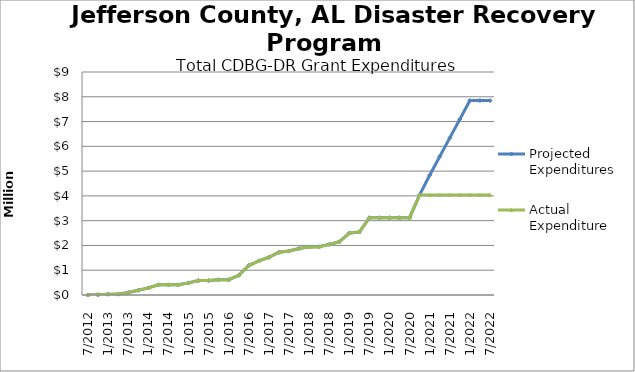
| Category | Projected Expenditures | Actual Expenditure |
|---|---|---|
| 7/2012 | 0 | 0 |
| 10/2012 | 14612 | 14612.19 |
| 1/2013 | 35137 | 35137.15 |
| 4/2013 | 35137 | 35137.15 |
| 7/2013 | 99693 | 99693.07 |
| 10/2013 | 190645 | 190645.12 |
| 1/2014 | 288122 | 288121.83 |
| 4/2014 | 410721 | 410720.72 |
| 7/2014 | 410721 | 410720.72 |
| 10/2014 | 410721 | 410720.72 |
| 1/2015 | 489424 | 489424.59 |
| 4/2015 | 584140 | 584140.61 |
| 7/2015 | 584140 | 584140.61 |
| 10/2015 | 616385 | 616385.28 |
| 1/2016 | 616385 | 616385.28 |
| 4/2016 | 795673 | 795673.36 |
| 7/2016 | 1189983 | 1189983.1 |
| 10/2016 | 1377739 | 1377739.09 |
| 1/2017 | 1523119 | 1523119.53 |
| 4/2017 | 1724726 | 1724725.79 |
| 7/2017 | 1773324 | 1773324.65 |
| 10/2017 | 1878724 | 1878724.29 |
| 1/2018 | 1941962 | 1941962.48 |
| 4/2018 | 1947910 | 1947910.72 |
| 7/2018 | 2042194 | 2042194.45 |
| 10/2018 | 2148250 | 2148250.32 |
| 1/2019 | 2498926.5 | 2498926.84 |
| 4/2019 | 2543081.63 | 2543081.94 |
| 7/2019 | 3119892.63 | 3119892.59 |
| 10/2019 | 3119892.63 | 3119892.59 |
| 1/2020 | 3119892.63 | 3119892.59 |
| 4/2020 | 3119892.63 | 3119892.59 |
| 7/2020 | 3119892.63 | 3119892.59 |
| 10/2020 | 4040448.63 | 4040448.83 |
| 1/2021 | 4834754.19 | 4040448.83 |
| 4/2021 | 5587961.55 | 4040448.83 |
| 7/2021 | 6341168.91 | 4040448.83 |
| 10/2021 | 7094376.27 | 4040448.83 |
| 1/2022 | 7847583.63 | 4040448.83 |
| 4/2022 | 7847583.63 | 4040448.83 |
| 7/2022 | 7847583.63 | 4040448.83 |